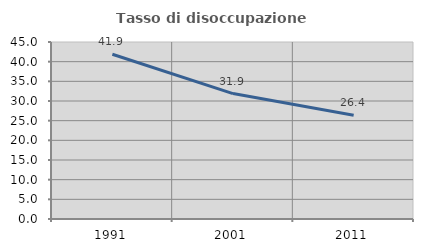
| Category | Tasso di disoccupazione giovanile  |
|---|---|
| 1991.0 | 41.892 |
| 2001.0 | 31.884 |
| 2011.0 | 26.389 |